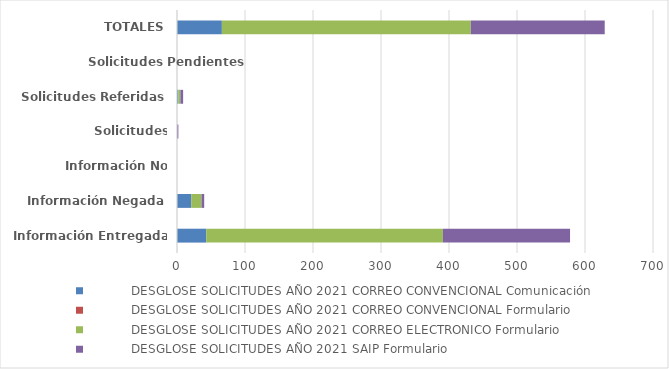
| Category |            DESGLOSE SOLICITUDES AÑO 2021 |
|---|---|
| Información Entregada | 187 |
| Información Negada | 4 |
| Información No Retirada | 0 |
| Solicitudes Desestimadas | 2 |
| Solicitudes Referidas | 4 |
| Solicitudes Pendientes | 0 |
| TOTALES | 197 |